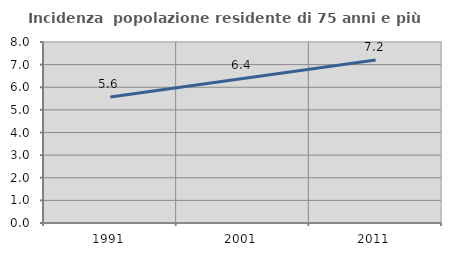
| Category | Incidenza  popolazione residente di 75 anni e più |
|---|---|
| 1991.0 | 5.566 |
| 2001.0 | 6.387 |
| 2011.0 | 7.203 |